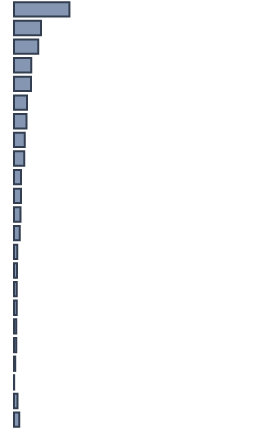
| Category | Percentatge |
|---|---|
| 0 | 23.095 |
| 1 | 11.254 |
| 2 | 10.154 |
| 3 | 7.233 |
| 4 | 7.072 |
| 5 | 5.44 |
| 6 | 5.179 |
| 7 | 4.462 |
| 8 | 4.223 |
| 9 | 2.907 |
| 10 | 2.866 |
| 11 | 2.724 |
| 12 | 2.424 |
| 13 | 1.316 |
| 14 | 1.23 |
| 15 | 1.196 |
| 16 | 1.117 |
| 17 | 0.98 |
| 18 | 0.915 |
| 19 | 0.506 |
| 20 | 0.067 |
| 21 | 1.438 |
| 22 | 2.202 |